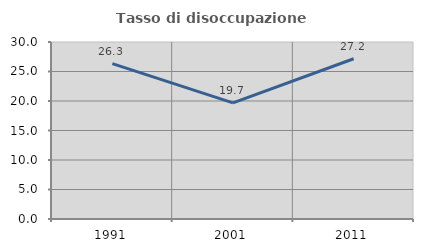
| Category | Tasso di disoccupazione giovanile  |
|---|---|
| 1991.0 | 26.323 |
| 2001.0 | 19.693 |
| 2011.0 | 27.16 |